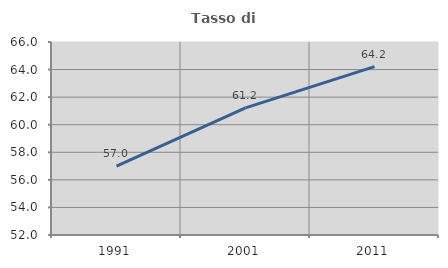
| Category | Tasso di occupazione   |
|---|---|
| 1991.0 | 56.989 |
| 2001.0 | 61.217 |
| 2011.0 | 64.214 |